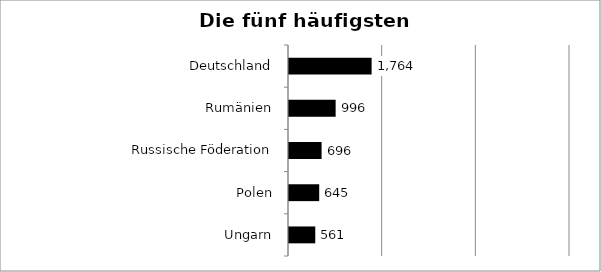
| Category | Series 0 |
|---|---|
| Ungarn | 561 |
| Polen | 645 |
| Russische Föderation | 696 |
| Rumänien | 996 |
| Deutschland | 1764 |